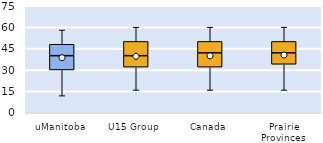
| Category | 25th | 50th | 75th |
|---|---|---|---|
| uManitoba | 30 | 10 | 8 |
| U15 Group | 32 | 8 | 10 |
| Canada | 32 | 10 | 8 |
| Prairie Provinces | 34 | 8 | 8 |